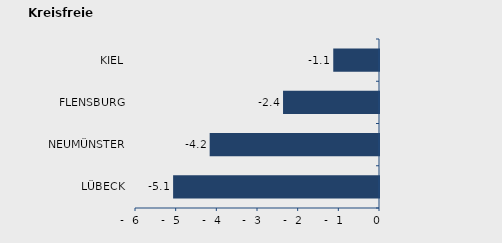
| Category | Überschuss der Geborenen (+) bzw. Gestorbenen (-) |
|---|---|
| LÜBECK | -5.063 |
| NEUMÜNSTER | -4.164 |
| FLENSBURG | -2.36 |
| KIEL | -1.125 |